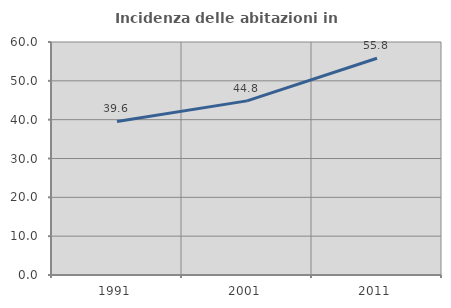
| Category | Incidenza delle abitazioni in proprietà  |
|---|---|
| 1991.0 | 39.554 |
| 2001.0 | 44.836 |
| 2011.0 | 55.804 |